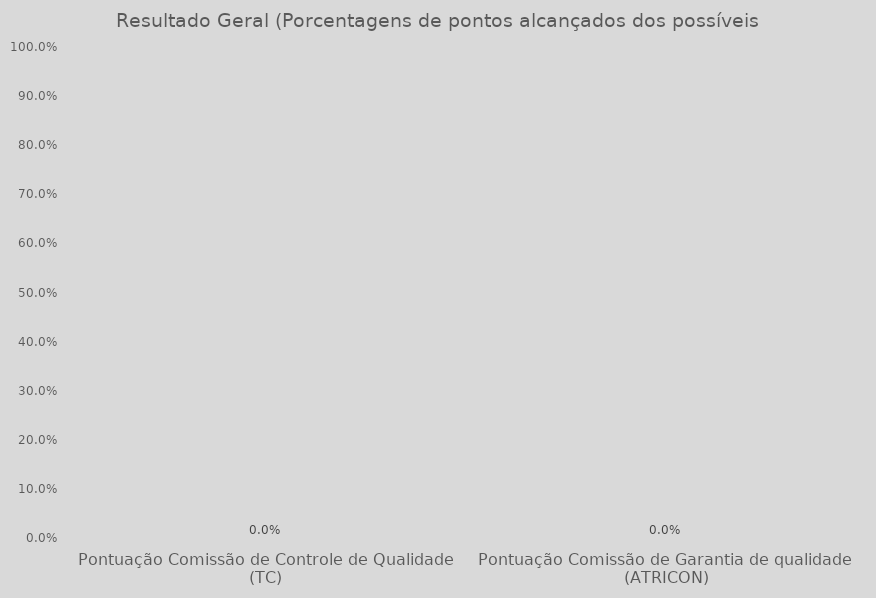
| Category | Series 0 |
|---|---|
| Pontuação Comissão de Controle de Qualidade
(TC) | 0 |
| Pontuação Comissão de Garantia de qualidade
(ATRICON) | 0 |